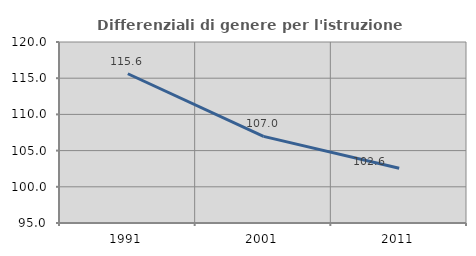
| Category | Differenziali di genere per l'istruzione superiore |
|---|---|
| 1991.0 | 115.616 |
| 2001.0 | 106.964 |
| 2011.0 | 102.57 |